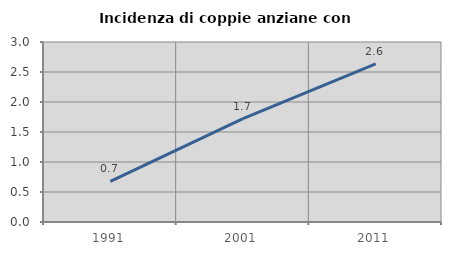
| Category | Incidenza di coppie anziane con figli |
|---|---|
| 1991.0 | 0.678 |
| 2001.0 | 1.724 |
| 2011.0 | 2.636 |